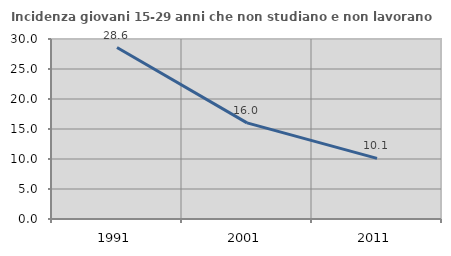
| Category | Incidenza giovani 15-29 anni che non studiano e non lavorano  |
|---|---|
| 1991.0 | 28.571 |
| 2001.0 | 16.017 |
| 2011.0 | 10.096 |